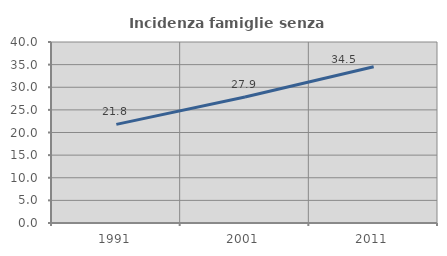
| Category | Incidenza famiglie senza nuclei |
|---|---|
| 1991.0 | 21.798 |
| 2001.0 | 27.862 |
| 2011.0 | 34.53 |